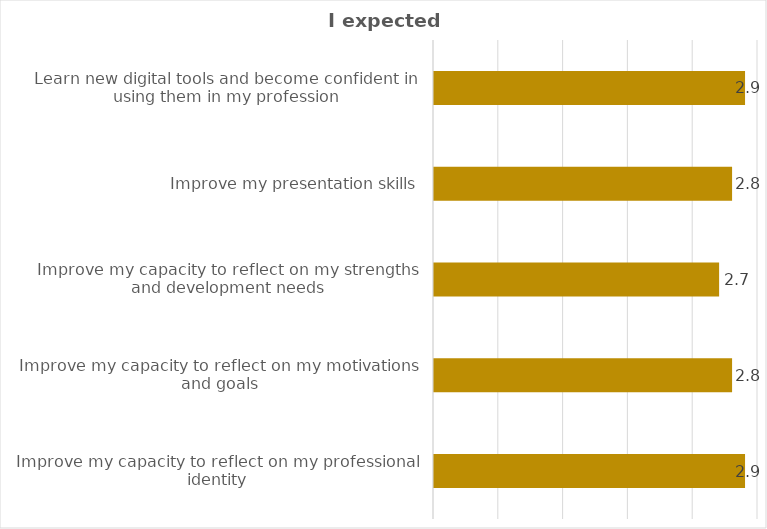
| Category | Series 0 |
|---|---|
| Improve my capacity to reflect on my professional identity | 2.9 |
| Improve my capacity to reflect on my motivations and goals | 2.8 |
| Improve my capacity to reflect on my strengths and development needs | 2.7 |
| Improve my presentation skills | 2.8 |
| Learn new digital tools and become confident in using them in my profession | 2.9 |